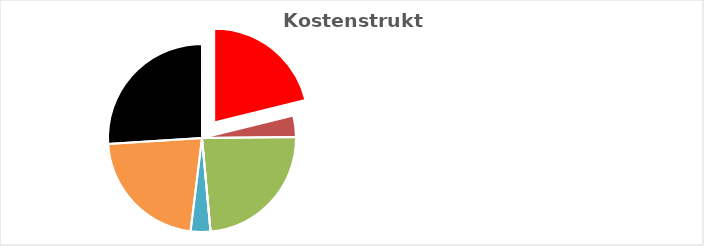
| Category | Series 0 |
|---|---|
| KV-Entgelt produktiv Tätige | 1 |
| Weitere Personalkosten produktiv | 0.173 |
| Personalnebenkosten | 1.121 |
| Unproduktives Personal | 0 |
| Deckung Personalgemeinkosten | 0.161 |
| Umlagen ohne GZ | 1.042 |
| Gesamtzuschlag | 1.229 |